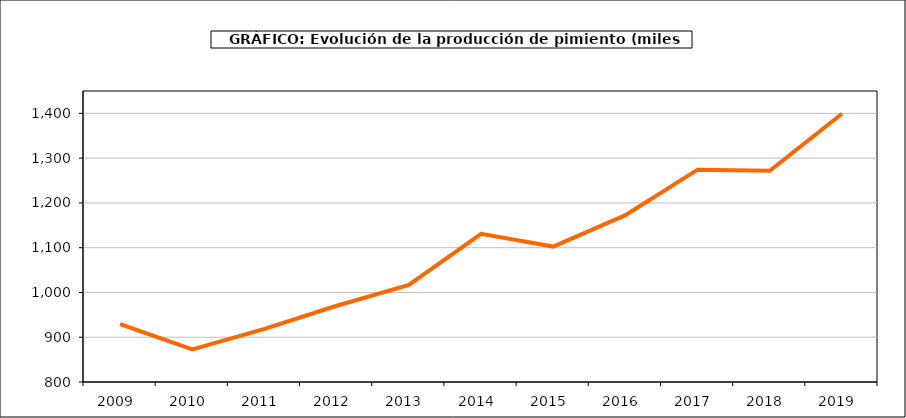
| Category | producción |
|---|---|
| 2009.0 | 929.317 |
| 2010.0 | 873.011 |
| 2011.0 | 918.549 |
| 2012.0 | 970.296 |
| 2013.0 | 1016.811 |
| 2014.0 | 1130.863 |
| 2015.0 | 1102.522 |
| 2016.0 | 1172.639 |
| 2017.0 | 1274.264 |
| 2018.0 | 1271.721 |
| 2019.0 | 1399.192 |